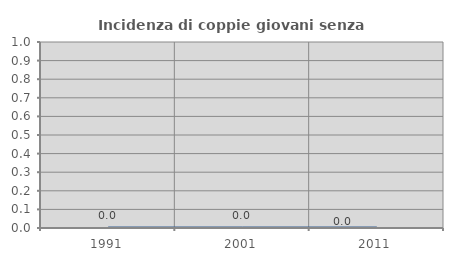
| Category | Incidenza di coppie giovani senza figli |
|---|---|
| 1991.0 | 0 |
| 2001.0 | 0 |
| 2011.0 | 0 |